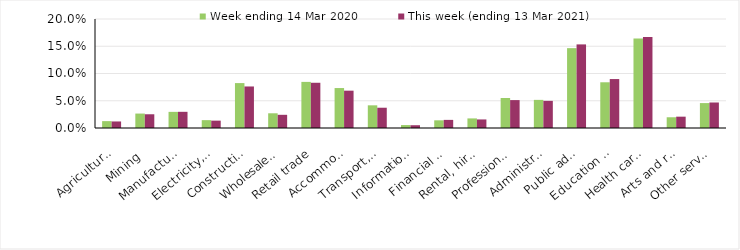
| Category | Week ending 14 Mar 2020 | This week (ending 13 Mar 2021) |
|---|---|---|
| Agriculture, forestry and fishing | 0.013 | 0.012 |
| Mining | 0.026 | 0.025 |
| Manufacturing | 0.03 | 0.03 |
| Electricity, gas, water and waste services | 0.014 | 0.014 |
| Construction | 0.082 | 0.076 |
| Wholesale trade | 0.027 | 0.024 |
| Retail trade | 0.085 | 0.083 |
| Accommodation and food services | 0.073 | 0.068 |
| Transport, postal and warehousing | 0.042 | 0.037 |
| Information media and telecommunications | 0.005 | 0.005 |
| Financial and insurance services | 0.014 | 0.015 |
| Rental, hiring and real estate services | 0.018 | 0.016 |
| Professional, scientific and technical services | 0.055 | 0.051 |
| Administrative and support services | 0.052 | 0.05 |
| Public administration and safety | 0.146 | 0.153 |
| Education and training | 0.084 | 0.09 |
| Health care and social assistance | 0.164 | 0.167 |
| Arts and recreation services | 0.02 | 0.021 |
| Other services | 0.046 | 0.047 |